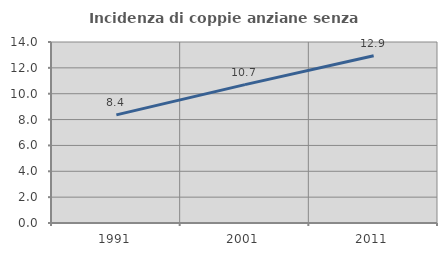
| Category | Incidenza di coppie anziane senza figli  |
|---|---|
| 1991.0 | 8.365 |
| 2001.0 | 10.704 |
| 2011.0 | 12.942 |